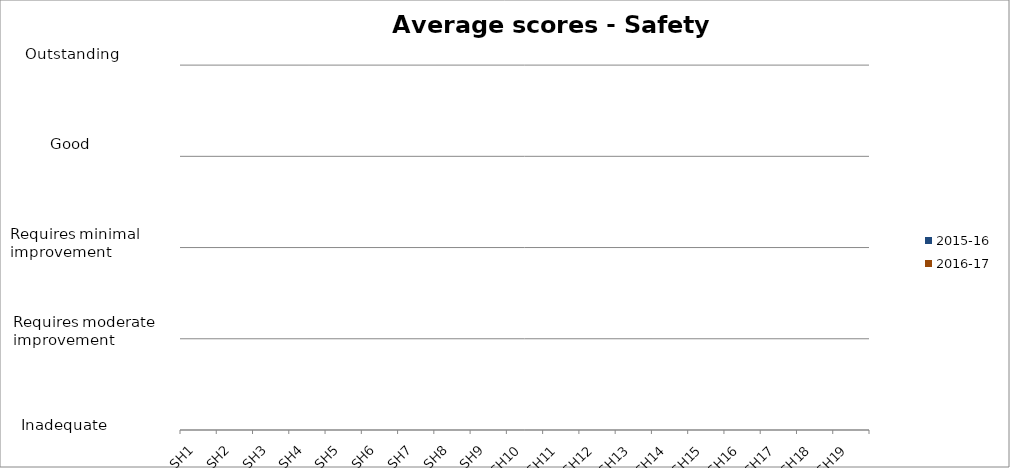
| Category | 2015-16 | 2016-17 |
|---|---|---|
| SH1 | 0 | 0 |
| SH2 | 0 | 0 |
| SH3 | 0 | 0 |
| SH4 | 0 | 0 |
| SH5 | 0 | 0 |
| SH6 | 0 | 0 |
| SH7 | 0 | 0 |
| SH8 | 0 | 0 |
| SH9 | 0 | 0 |
| SH10 | 0 | 0 |
| SH11 | 0 | 0 |
| SH12 | 0 | 0 |
| SH13 | 0 | 0 |
| SH14 | 0 | 0 |
| SH15 | 0 | 0 |
| SH16 | 0 | 0 |
| SH17 | 0 | 0 |
| SH18 | 0 | 0 |
| SH19 | 0 | 0 |